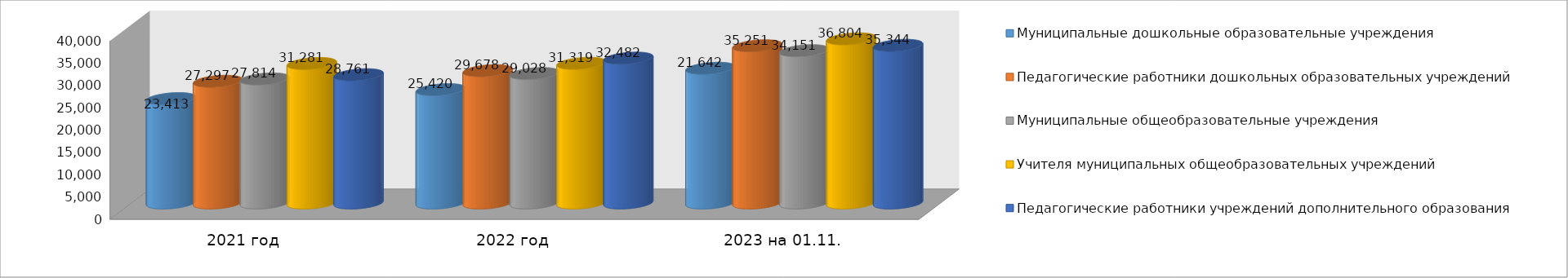
| Category | Муниципальные дошкольные образовательные учреждения | Педагогические работники дошкольных образовательных учреждений | Муниципальные общеобразовательные учреждения | Учителя муниципальных общеобразовательных учреждений | Педагогические работники учреждений дополнительного образования |
|---|---|---|---|---|---|
| 2021 год | 23413 | 27297 | 27814 | 31281 | 28761 |
| 2022 год | 25420 | 29678 | 29028 | 31319 | 32482 |
| 2023 на 01.11. | 30217 | 35251 | 34151 | 36804 | 35344 |